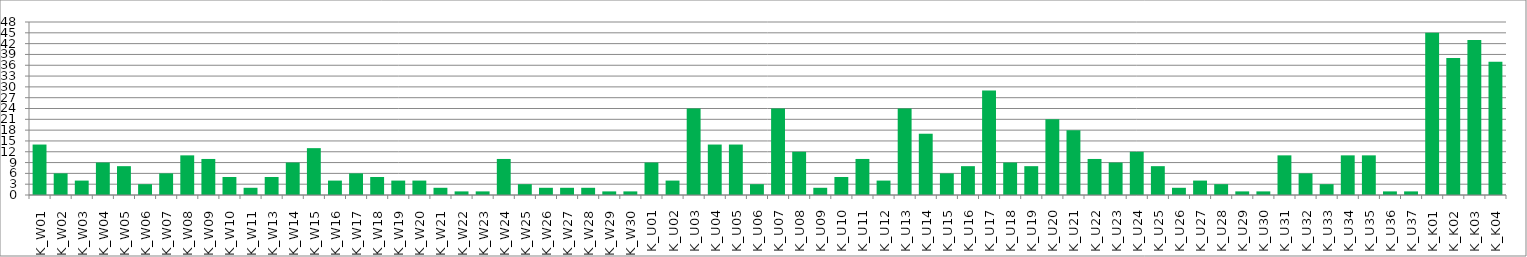
| Category | Series 0 |
|---|---|
| K_W01 | 14 |
| K_W02 | 6 |
| K_W03 | 4 |
| K_W04 | 9 |
| K_W05 | 8 |
| K_W06 | 3 |
| K_W07 | 6 |
| K_W08 | 11 |
| K_W09 | 10 |
| K_W10 | 5 |
| K_W11 | 2 |
| K_W13 | 5 |
| K_W14 | 9 |
| K_W15 | 13 |
| K_W16 | 4 |
| K_W17 | 6 |
| K_W18 | 5 |
| K_W19 | 4 |
| K_W20 | 4 |
| K_W21 | 2 |
| K_W22 | 1 |
| K_W23 | 1 |
| K_W24 | 10 |
| K_W25 | 3 |
| K_W26 | 2 |
| K_W27 | 2 |
| K_W28 | 2 |
| K_W29 | 1 |
| K_W30 | 1 |
| K_U01 | 9 |
| K_U02 | 4 |
| K_U03 | 24 |
| K_U04 | 14 |
| K_U05 | 14 |
| K_U06 | 3 |
| K_U07 | 24 |
| K_U08 | 12 |
| K_U09 | 2 |
| K_U10 | 5 |
| K_U11 | 10 |
| K_U12 | 4 |
| K_U13 | 24 |
| K_U14 | 17 |
| K_U15 | 6 |
| K_U16 | 8 |
| K_U17 | 29 |
| K_U18 | 9 |
| K_U19 | 8 |
| K_U20 | 21 |
| K_U21 | 18 |
| K_U22 | 10 |
| K_U23 | 9 |
| K_U24 | 12 |
| K_U25 | 8 |
| K_U26 | 2 |
| K_U27 | 4 |
| K_U28 | 3 |
| K_U29 | 1 |
| K_U30 | 1 |
| K_U31 | 11 |
| K_U32 | 6 |
| K_U33 | 3 |
| K_U34 | 11 |
| K_U35 | 11 |
| K_U36 | 1 |
| K_U37 | 1 |
| K_K01 | 45 |
| K_K02 | 38 |
| K_K03 | 43 |
| K_K04 | 37 |